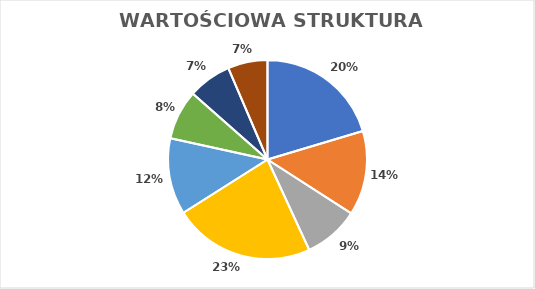
| Category | Series 0 |
|---|---|
| 0 | 0.204 |
| 1 | 0.137 |
| 2 | 0.09 |
| 3 | 0.229 |
| 4 | 0.124 |
| 5 | 0.081 |
| 6 | 0.071 |
| 7 | 0.064 |